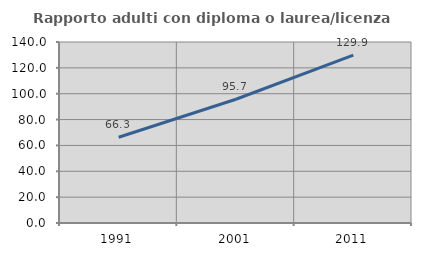
| Category | Rapporto adulti con diploma o laurea/licenza media  |
|---|---|
| 1991.0 | 66.349 |
| 2001.0 | 95.739 |
| 2011.0 | 129.904 |